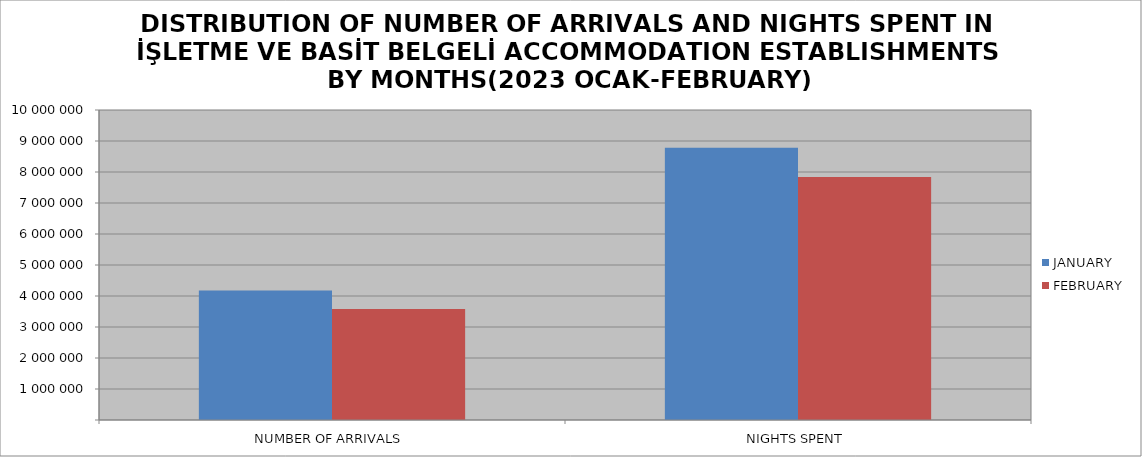
| Category | JANUARY | FEBRUARY |
|---|---|---|
| NUMBER OF ARRIVALS | 4176369 | 3577989 |
| NIGHTS SPENT | 8783046 | 7837722 |